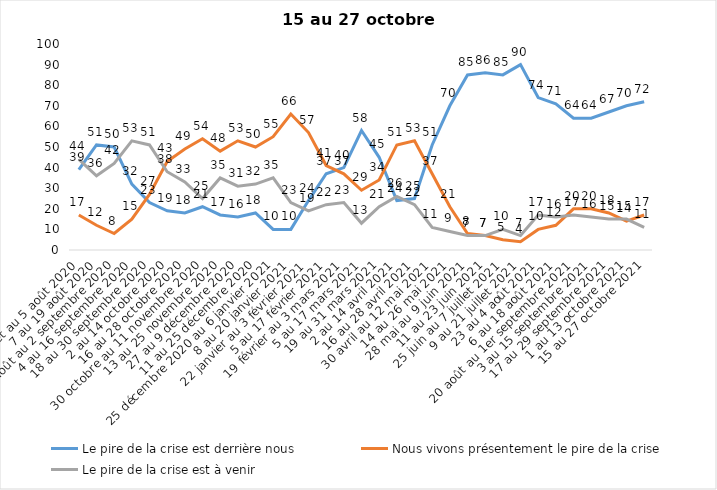
| Category | Le pire de la crise est derrière nous | Nous vivons présentement le pire de la crise | Le pire de la crise est à venir |
|---|---|---|---|
| 24 juillet au 5 août 2020 | 39 | 17 | 44 |
| 7 au 19 août 2020 | 51 | 12 | 36 |
| 21 août au 2 septembre 2020 | 50 | 8 | 42 |
| 4 au 16 septembre 2020 | 32 | 15 | 53 |
| 18 au 30 septembre 2020 | 23 | 27 | 51 |
| 2 au 14 octobre 2020 | 19 | 43 | 38 |
| 16 au 28 octobre 2020 | 18 | 49 | 33 |
| 30 octobre au 11 novembre 2020 | 21 | 54 | 25 |
| 13 au 25 novembre 2020 | 17 | 48 | 35 |
| 27 au 9 décembre 2020 | 16 | 53 | 31 |
| 11 au 25 décembre 2020 | 18 | 50 | 32 |
| 25 décembre 2020 au 6 janvier 2021 | 10 | 55 | 35 |
| 8 au 20 janvier 2021 | 10 | 66 | 23 |
| 22 janvier au 3 février 2021 | 24 | 57 | 19 |
| 5 au 17 février 2021 | 37 | 41 | 22 |
| 19 février au 3 mars 2021 | 40 | 37 | 23 |
| 5 au 17 mars 2021 | 58 | 29 | 13 |
| 19 au 31 mars 2021 | 45 | 34 | 21 |
| 2 au 14 avril 2021 | 24 | 51 | 26 |
| 16 au 28 avril 2021 | 25 | 53 | 22 |
| 30 avril au 12 mai 2021 | 51 | 37 | 11 |
| 14 au 26 mai 2021 | 70 | 21 | 9 |
| 28 mai au 9 juin 2021 | 85 | 8 | 7 |
| 11 au 23 juin 2021 | 86 | 7 | 7 |
| 25 juin au 7 juillet 2021 | 85 | 5 | 10 |
| 9 au 21 juillet 2021 | 90 | 4 | 7 |
| 23 au 4 août 2021 | 74 | 10 | 17 |
| 6 au 18 août 2021 | 71 | 12 | 16 |
| 20 août au 1er septembre 2021 | 64 | 20 | 17 |
| 3 au 15 septembre 2021 | 64 | 20 | 16 |
| 17 au 29 septembre 2021 | 67 | 18 | 15 |
| 1 au 13 octobre 2021 | 70 | 14 | 15 |
| 15 au 27 octobre 2021 | 72 | 17 | 11 |